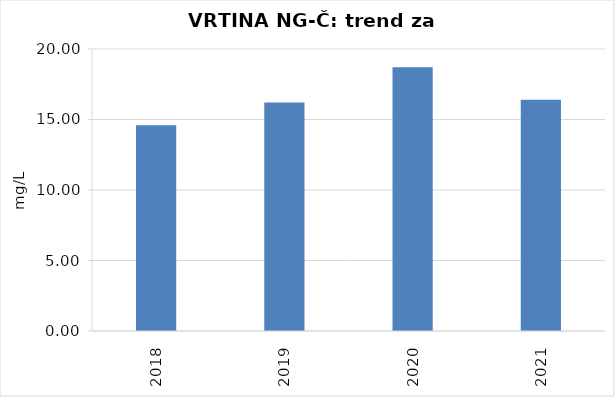
| Category | Vsota |
|---|---|
| 2018 | 14.6 |
| 2019 | 16.2 |
| 2020 | 18.7 |
| 2021 | 16.4 |